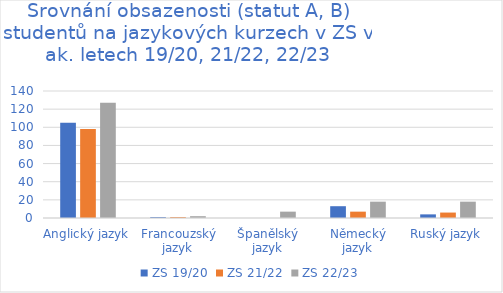
| Category | ZS 19/20 | ZS 21/22 | ZS 22/23 |
|---|---|---|---|
| Anglický jazyk | 105 | 98 | 127 |
| Francouzský jazyk | 1 | 1 | 2 |
| Španělský jazyk | 0 | 0 | 7 |
| Německý jazyk | 13 | 7 | 18 |
| Ruský jazyk | 4 | 6 | 18 |